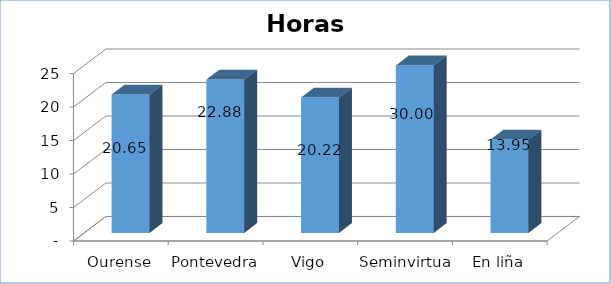
| Category | Horas formación/persoa |
|---|---|
| Ourense | 20.646 |
| Pontevedra | 22.882 |
| Vigo | 20.221 |
| Seminvirtual | 30 |
| En liña | 13.952 |